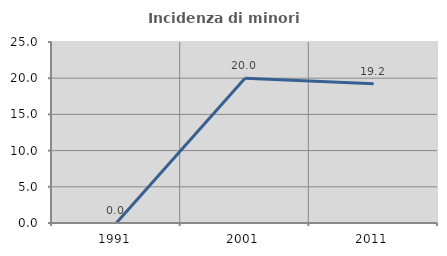
| Category | Incidenza di minori stranieri |
|---|---|
| 1991.0 | 0 |
| 2001.0 | 20 |
| 2011.0 | 19.231 |